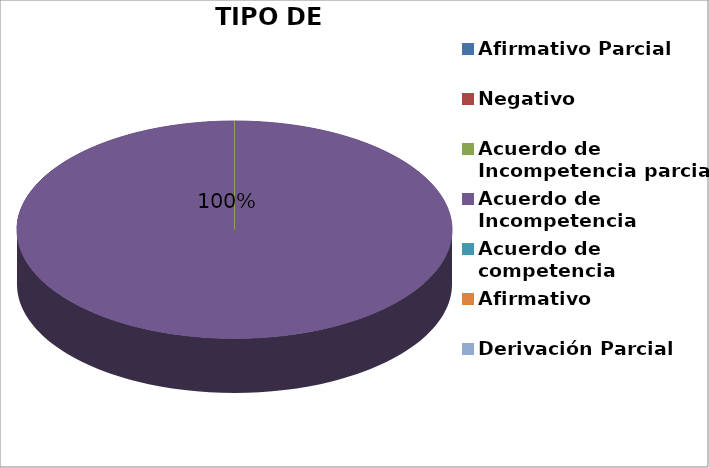
| Category | Series 0 |
|---|---|
| Afirmativo Parcial | 0 |
| Negativo | 0 |
| Acuerdo de Incompetencia parcial | 0 |
| Acuerdo de Incompetencia | 1 |
| Acuerdo de competencia | 0 |
| Afirmativo | 0 |
| Derivación Parcial | 0 |